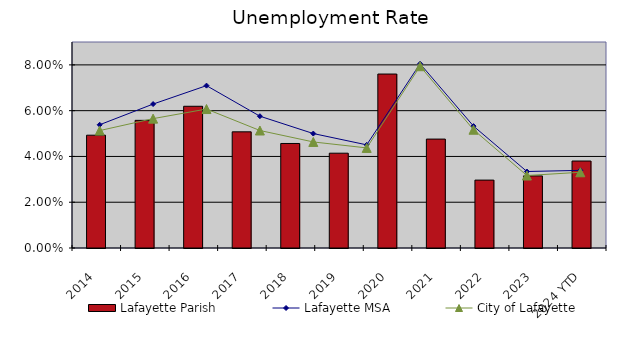
| Category | Lafayette Parish |
|---|---|
| 2014 | 0.049 |
| 2015 | 0.056 |
| 2016 | 0.062 |
| 2017 | 0.051 |
| 2018 | 0.046 |
| 2019 | 0.041 |
| 2020 | 0.076 |
| 2021 | 0.048 |
| 2022 | 0.03 |
| 2023 | 0.032 |
| 2024 YTD | 0.038 |